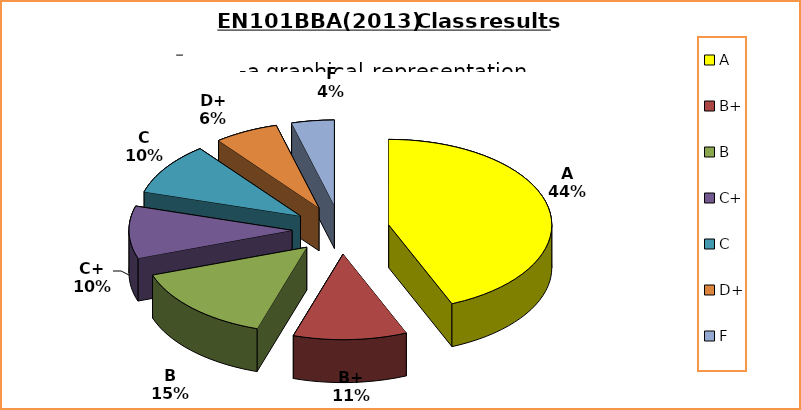
| Category | Series 0 |
|---|---|
| A | 62 |
| B+ | 16 |
| B | 21 |
| C+ | 14 |
| C | 14 |
| D+ | 9 |
| F | 6 |